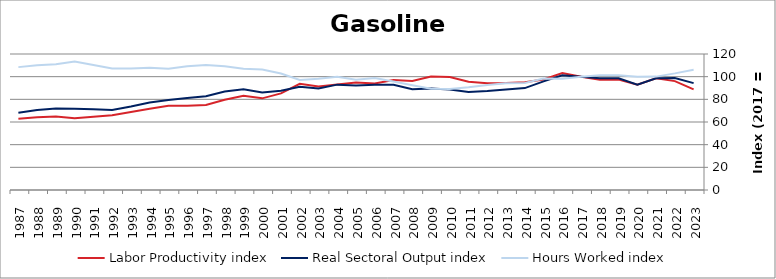
| Category | Labor Productivity index | Real Sectoral Output index | Hours Worked index |
|---|---|---|---|
| 2023.0 | 88.825 | 94.309 | 106.174 |
| 2022.0 | 96.06 | 98.841 | 102.896 |
| 2021.0 | 98.598 | 98.637 | 100.04 |
| 2020.0 | 92.969 | 92.907 | 99.933 |
| 2019.0 | 97.434 | 98.637 | 101.235 |
| 2018.0 | 97.353 | 98.618 | 101.3 |
| 2017.0 | 100 | 100 | 100 |
| 2016.0 | 103.133 | 101.3 | 98.222 |
| 2015.0 | 97.51 | 95.884 | 98.333 |
| 2014.0 | 95.122 | 89.905 | 94.516 |
| 2013.0 | 94.31 | 88.748 | 94.102 |
| 2012.0 | 94.17 | 87.337 | 92.744 |
| 2011.0 | 95.445 | 86.475 | 90.601 |
| 2010.0 | 99.693 | 88.74 | 89.013 |
| 2009.0 | 100.229 | 89.612 | 89.407 |
| 2008.0 | 96.167 | 88.862 | 92.403 |
| 2007.0 | 97.075 | 92.848 | 95.645 |
| 2006.0 | 94.041 | 92.925 | 98.813 |
| 2005.0 | 94.78 | 92.128 | 97.202 |
| 2004.0 | 93.049 | 92.962 | 99.906 |
| 2003.0 | 91.371 | 89.668 | 98.136 |
| 2002.0 | 93.746 | 91.01 | 97.081 |
| 2001.0 | 85.26 | 87.675 | 102.832 |
| 2000.0 | 80.869 | 86.03 | 106.383 |
| 1999.0 | 83.153 | 88.909 | 106.923 |
| 1998.0 | 79.591 | 86.957 | 109.256 |
| 1997.0 | 75.047 | 82.789 | 110.316 |
| 1996.0 | 74.306 | 81.098 | 109.14 |
| 1995.0 | 74.367 | 79.506 | 106.911 |
| 1994.0 | 71.668 | 77.294 | 107.85 |
| 1993.0 | 68.738 | 73.664 | 107.166 |
| 1992.0 | 65.906 | 70.689 | 107.258 |
| 1991.0 | 64.552 | 71.209 | 110.313 |
| 1990.0 | 63.301 | 71.728 | 113.313 |
| 1989.0 | 64.77 | 71.807 | 110.864 |
| 1988.0 | 64.09 | 70.512 | 110.021 |
| 1987.0 | 62.797 | 68.084 | 108.419 |